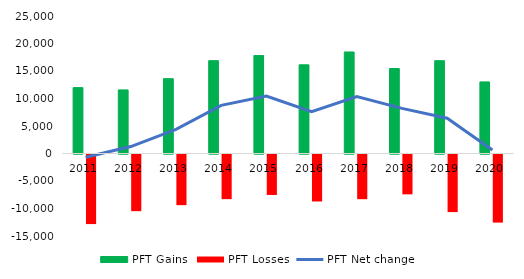
| Category | PFT Gains  | PFT Losses |
|---|---|---|
| 2011.0 | 11981 | -12650 |
| 2012.0 | 11560 | -10302 |
| 2013.0 | 13607 | -9209 |
| 2014.0 | 16880 | -8118 |
| 2015.0 | 17809 | -7357 |
| 2016.0 | 16125 | -8541 |
| 2017.0 | 18462 | -8125 |
| 2018.0 | 15450 | -7242 |
| 2019.0 | 16878 | -10470 |
| 2020.0 | 13013 | -12380 |